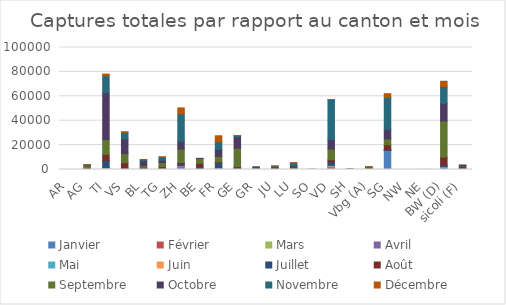
| Category | Janvier | Février | Mars | Avril | Mai | Juin | Juillet | Août | Septembre | Octobre | Novembre | Décembre |
|---|---|---|---|---|---|---|---|---|---|---|---|---|
| AR | 0 | 0 | 0 | 0 | 0 | 0 | 0 | 0 | 0 | 0 | 0 | 0 |
| AG | 39 | 0 | 12 | 38 | 63 | 56 | 445 | 717 | 1853 | 531 | 86 | 4 |
| TI | 689 | 104 | 137 | 477 | 90 | 170 | 5798 | 4910 | 12152 | 38312 | 14069 | 1321 |
| VS | 129 | 3 | 1 | 51 | 48 | 33 | 808 | 4561 | 7304 | 12012 | 5546 | 438 |
| BL | 0 | 0 | 0 | 13 | 14 | 74 | 1105 | 527 | 1505 | 3915 | 983 | 87 |
| TG | 288 | 0 | 5 | 0 | 8 | 6 | 231 | 1841 | 3340 | 2068 | 2420 | 123 |
| ZH | 3087 | 4 | 10 | 39 | 19 | 75 | 1251 | 1216 | 10973.5 | 6561 | 22310 | 4958 |
| BE | 12 | 1 | 5 | 52 | 54 | 136 | 1956 | 2791 | 4007 | 144 | 0 | 0 |
| FR | 554 | 0 | 0 | 234 | 328 | 135 | 4106 | 878 | 4485 | 5718 | 6189 | 5031 |
| GE | 0 | 0 | 0 | 112 | 190 | 135 | 740 | 1156 | 15160 | 9291 | 1085 | 47 |
| GR | 0 | 0 | 0 | 0 | 0 | 0 | 0 | 353 | 1093 | 778 | 0 | 0 |
| JU | 24 | 1 | 1 | 0 | 1 | 22 | 70 | 83 | 804 | 1200 | 625 | 84 |
| LU | 0 | 48 | 3 | 3 | 0 | 8 | 158 | 357 | 1253 | 1253 | 2318 | 137 |
| SO | 2 | 0 | 0 | 2 | 2 | 23 | 33 | 55 | 12 | 0 | 0 | 0 |
| VD | 972 | 838 | 51 | 348 | 688 | 489 | 2865 | 1724 | 8823 | 7753 | 32832 | 11 |
| SH | 0 | 0 | 0 | 0 | 0 | 0 | 13 | 36 | 254 | 86 | 0 | 0 |
| Vbg (A) | 166 | 1 | 0 | 0 | 0 | 7 | 90 | 178 | 1139 | 275 | 317 | 140 |
| SG | 15564 | 0 | 17 | 32 | 6 | 8 | 688 | 3962 | 4806 | 7892 | 26199 | 2986 |
| NW | 0 | 0 | 0 | 2 | 0 | 5 | 0 | 0 | 0 | 0 | 0 | 0 |
| NE | 0 | 0 | 0 | 0 | 0 | 0 | 1 | 22 | 57 | 0 | 0 | 0 |
| BW (D) | 2266 | 0 | 6 | 10 | 79 | 145 | 1374 | 6279 | 29664 | 14323 | 13890 | 4307 |
| sicoli (F) | 243.5 | 1.5 | 23.5 | 14.5 | 18 | 133.25 | 1430.55 | 804 | 507 | 557 | 0 | 0 |